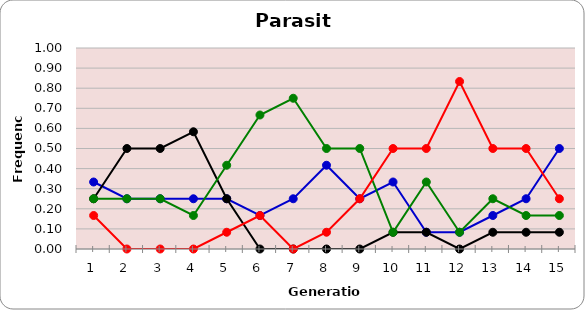
| Category | Sp | Cl | Di | He |
|---|---|---|---|---|
| 1.0 | 0.333 | 0.25 | 0.25 | 0.167 |
| 2.0 | 0.25 | 0.5 | 0.25 | 0 |
| 3.0 | 0.25 | 0.5 | 0.25 | 0 |
| 4.0 | 0.25 | 0.583 | 0.167 | 0 |
| 5.0 | 0.25 | 0.25 | 0.417 | 0.083 |
| 6.0 | 0.167 | 0 | 0.667 | 0.167 |
| 7.0 | 0.25 | 0 | 0.75 | 0 |
| 8.0 | 0.417 | 0 | 0.5 | 0.083 |
| 9.0 | 0.25 | 0 | 0.5 | 0.25 |
| 10.0 | 0.333 | 0.083 | 0.083 | 0.5 |
| 11.0 | 0.083 | 0.083 | 0.333 | 0.5 |
| 12.0 | 0.083 | 0 | 0.083 | 0.833 |
| 13.0 | 0.167 | 0.083 | 0.25 | 0.5 |
| 14.0 | 0.25 | 0.083 | 0.167 | 0.5 |
| 15.0 | 0.5 | 0.083 | 0.167 | 0.25 |